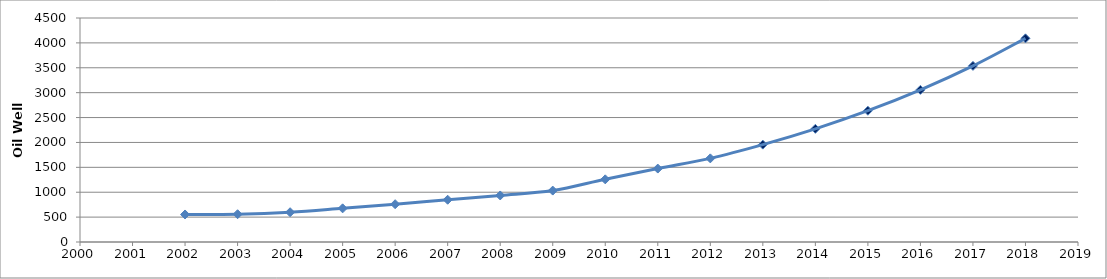
| Category | Series 0 |
|---|---|
| 2002.0 | 553 |
| 2003.0 | 558 |
| 2004.0 | 598 |
| 2005.0 | 676 |
| 2006.0 | 759 |
| 2007.0 | 849 |
| 2008.0 | 935 |
| 2009.0 | 1033 |
| 2010.0 | 1259 |
| 2011.0 | 1475 |
| 2012.0 | 1680 |
| 2013.0 | 1955.882 |
| 2014.0 | 2273.009 |
| 2015.0 | 2637.55 |
| 2016.0 | 3056.592 |
| 2017.0 | 3538.284 |
| 2018.0 | 4091.991 |